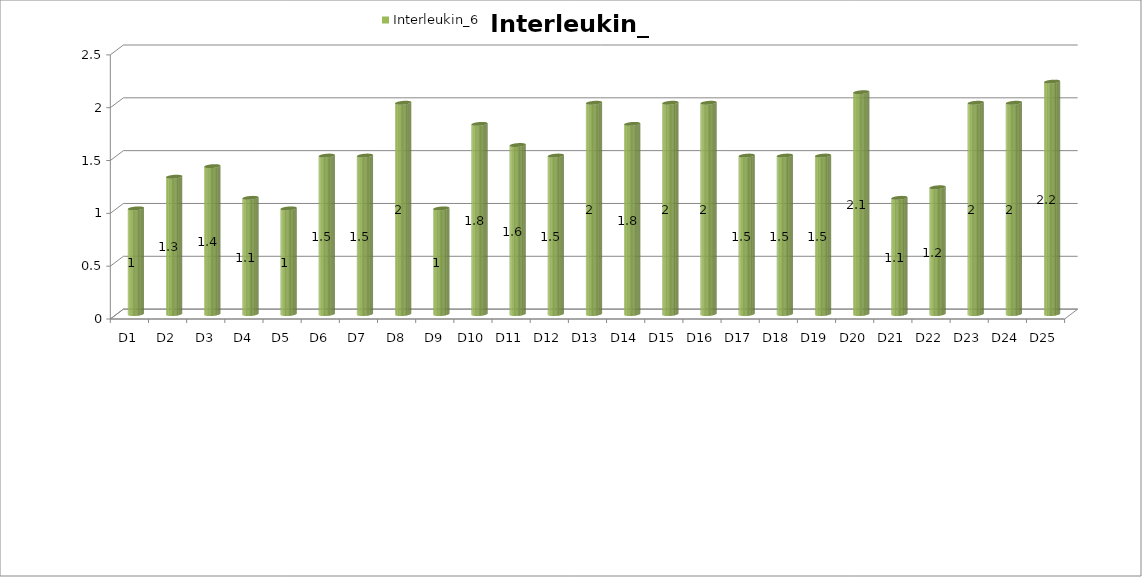
| Category | Interleukin_6 |
|---|---|
| D1 | 1 |
| D2 | 1.3 |
| D3 | 1.4 |
| D4 | 1.1 |
| D5 | 1 |
| D6 | 1.5 |
| D7 | 1.5 |
| D8 | 2 |
| D9 | 1 |
| D10 | 1.8 |
| D11 | 1.6 |
| D12 | 1.5 |
| D13 | 2 |
| D14 | 1.8 |
| D15 | 2 |
| D16 | 2 |
| D17 | 1.5 |
| D18 | 1.5 |
| D19 | 1.5 |
| D20 | 2.1 |
| D21 | 1.1 |
| D22 | 1.2 |
| D23 | 2 |
| D24 | 2 |
| D25 | 2.2 |